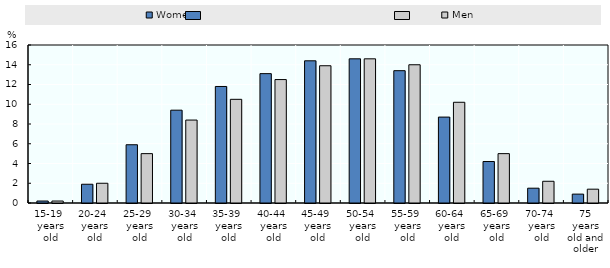
| Category | Women | Men |
|---|---|---|
| 15-19 
years old | 0.2 | 0.2 |
| 20-24 
years old | 1.9 | 2 |
| 25-29 
years old | 5.9 | 5 |
| 30-34 
years old | 9.4 | 8.4 |
| 35-39 
years old | 11.8 | 10.5 |
| 40-44 
years old | 13.1 | 12.5 |
| 45-49 
years old | 14.4 | 13.9 |
| 50-54 
years old | 14.6 | 14.6 |
| 55-59 
years old | 13.4 | 14 |
| 60-64 
years old | 8.7 | 10.2 |
| 65-69 
years old | 4.2 | 5 |
| 70-74 
years old | 1.5 | 2.2 |
| 75 years old and older | 0.9 | 1.4 |